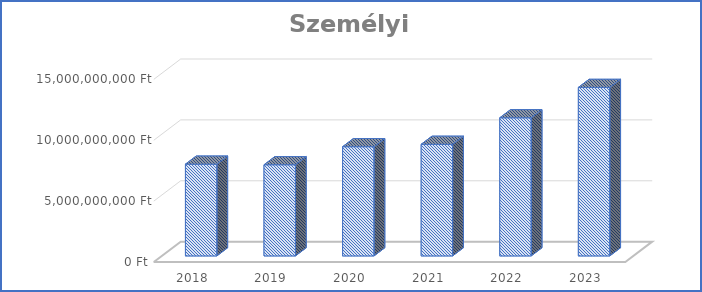
| Category | Személyi juttatások |
|---|---|
| 2018.0 | 7532985548 |
| 2019.0 | 7484578131 |
| 2020.0 | 8967604485 |
| 2021.0 | 9163782444 |
| 2022.0 | 11342642101 |
| 2023.0 | 13836537368 |